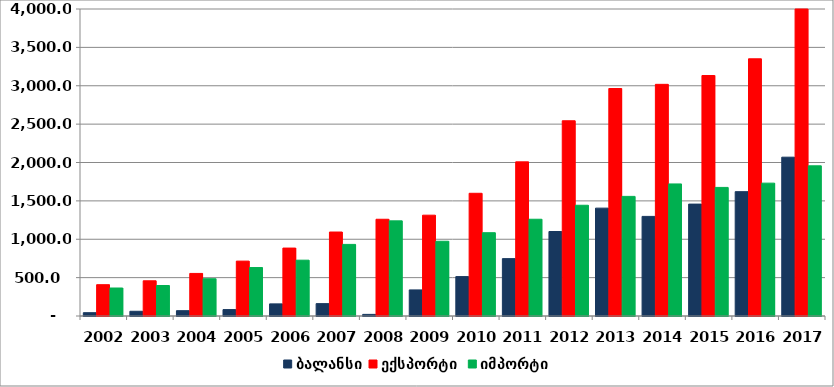
| Category | ბალანსი | ექსპორტი  | იმპორტი |
|---|---|---|---|
| 2002.0 | 42.999 | 407.779 | 364.78 |
| 2003.0 | 61.547 | 458.843 | 397.296 |
| 2004.0 | 69.318 | 554.762 | 485.444 |
| 2005.0 | 83.591 | 715.043 | 631.452 |
| 2006.0 | 157.824 | 885.086 | 727.262 |
| 2007.0 | 161.189 | 1094.109 | 932.92 |
| 2008.0 | 21.03 | 1260.454 | 1239.424 |
| 2009.0 | 339.726 | 1313.609 | 973.883 |
| 2010.0 | 513.454 | 1598.771 | 1085.317 |
| 2011.0 | 747.465 | 2008.157 | 1260.692 |
| 2012.0 | 1100.853 | 2543.662 | 1442.809 |
| 2013.0 | 1405.472 | 2964.033 | 1558.561 |
| 2014.0 | 1297.802 | 3018.497 | 1720.695 |
| 2015.0 | 1457.874 | 3133.234 | 1675.36 |
| 2016.0 | 1620.052 | 3351.082 | 1731.03 |
| 2017.0 | 2069.26 | 4026.012 | 1956.752 |